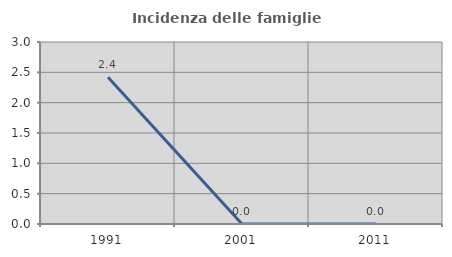
| Category | Incidenza delle famiglie numerose |
|---|---|
| 1991.0 | 2.419 |
| 2001.0 | 0 |
| 2011.0 | 0 |